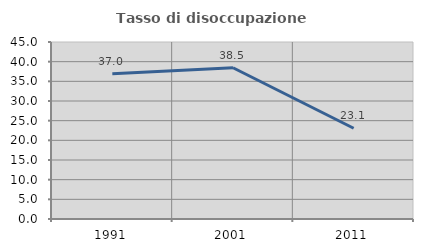
| Category | Tasso di disoccupazione giovanile  |
|---|---|
| 1991.0 | 36.957 |
| 2001.0 | 38.462 |
| 2011.0 | 23.077 |